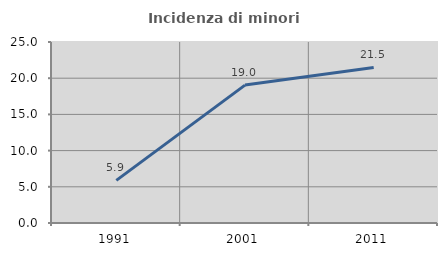
| Category | Incidenza di minori stranieri |
|---|---|
| 1991.0 | 5.882 |
| 2001.0 | 19.048 |
| 2011.0 | 21.488 |